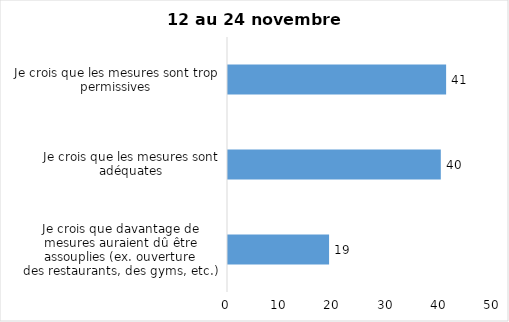
| Category | Series 0 |
|---|---|
| Je crois que davantage de mesures auraient dû être assouplies (ex. ouverture
des restaurants, des gyms, etc.) | 19 |
| Je crois que les mesures sont adéquates | 40 |
| Je crois que les mesures sont trop permissives | 41 |